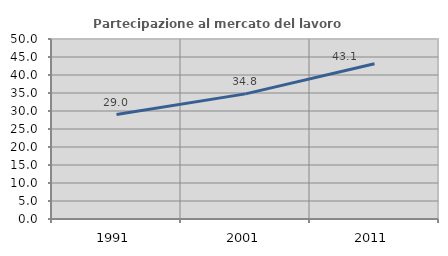
| Category | Partecipazione al mercato del lavoro  femminile |
|---|---|
| 1991.0 | 29.027 |
| 2001.0 | 34.762 |
| 2011.0 | 43.103 |